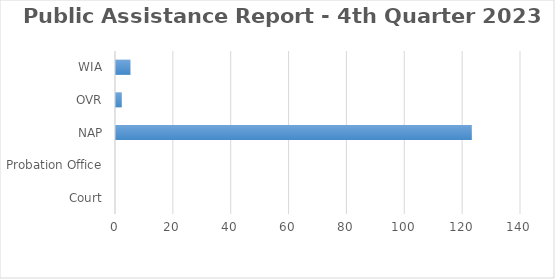
| Category | Series 0 |
|---|---|
| Court | 0 |
| Probation Office | 0 |
| NAP | 123 |
| OVR | 2 |
| WIA | 5 |